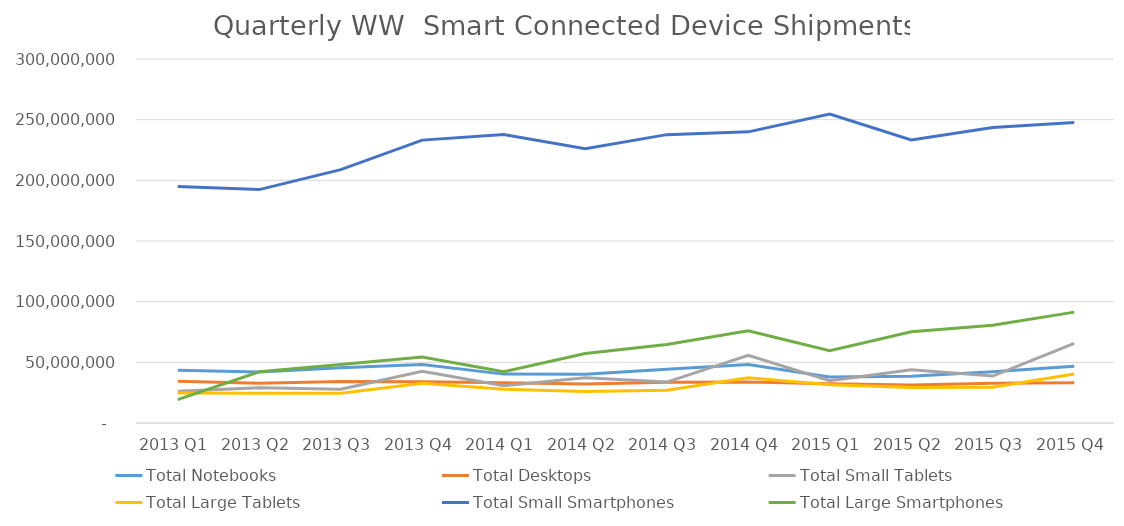
| Category | Total Notebooks | Total Desktops | Total Small Tablets | Total Large Tablets | Total Small Smartphones | Total Large Smartphones |
|---|---|---|---|---|---|---|
| 2013 Q1 | 43425399 | 34312656 | 26092840 | 24651547 | 194946956 | 19326054 |
| 2013 Q2 | 42104738 | 32824880 | 29130648 | 24476806 | 192371795 | 42186723 |
| 2013 Q3 | 45575676 | 34232529 | 27866846 | 24438476 | 208823403 | 48234522 |
| 2013 Q4 | 48306627 | 34073648 | 42628357 | 32842055 | 233152456 | 54393937 |
| 2014 Q1 | 40287868 | 33237497 | 30786495 | 27813373 | 237720326 | 42286204 |
| 2014 Q2 | 40146117 | 32240216 | 37265085 | 26044254 | 225970940 | 57257729 |
| 2014 Q3 | 44358715 | 33632310 | 33726210 | 27067367 | 237658840 | 64613221 |
| 2014 Q4 | 48254937 | 33875000 | 55780381 | 37229843 | 239966451 | 75992337 |
| 2015 Q1 | 37835358 | 32256734 | 34872145 | 31604688 | 254585596 | 59590543 |
| 2015 Q2 | 38578988 | 31299571 | 43961965 | 29282390 | 233246270 | 75195961 |
| 2015 Q3 | 42324692 | 32828635 | 38706760 | 29491683 | 243563833 | 80622226 |
| 2015 Q4 | 46846582 | 33202264 | 65568285 | 40389627 | 247642942 | 91379048 |